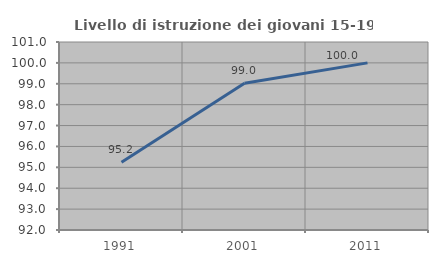
| Category | Livello di istruzione dei giovani 15-19 anni |
|---|---|
| 1991.0 | 95.238 |
| 2001.0 | 99.029 |
| 2011.0 | 100 |